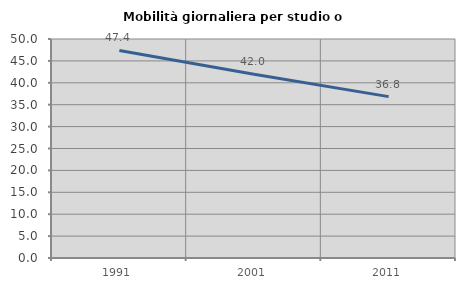
| Category | Mobilità giornaliera per studio o lavoro |
|---|---|
| 1991.0 | 47.393 |
| 2001.0 | 41.964 |
| 2011.0 | 36.842 |